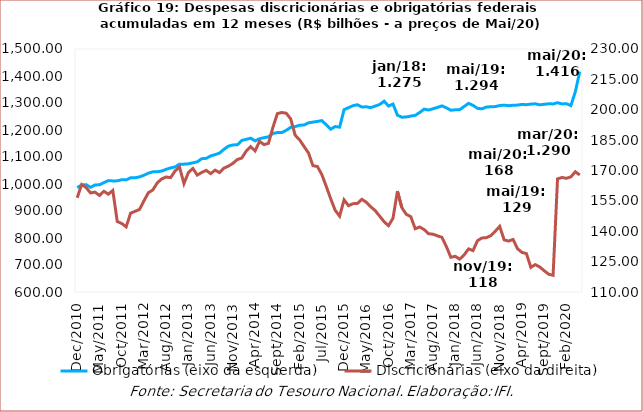
| Category | Obrigatórias (eixo da esquerda) |
|---|---|
| 2010-12-01 | 986781.688 |
| 2011-01-01 | 996172.239 |
| 2011-02-01 | 997634.296 |
| 2011-03-01 | 987635.4 |
| 2011-04-01 | 996568.562 |
| 2011-05-01 | 996931.85 |
| 2011-06-01 | 1005170.589 |
| 2011-07-01 | 1012610.651 |
| 2011-08-01 | 1011457.33 |
| 2011-09-01 | 1011617.294 |
| 2011-10-01 | 1015788.491 |
| 2011-11-01 | 1015213.034 |
| 2011-12-01 | 1022873.667 |
| 2012-01-01 | 1023050.58 |
| 2012-02-01 | 1026378.137 |
| 2012-03-01 | 1032361.754 |
| 2012-04-01 | 1040083.53 |
| 2012-05-01 | 1045125.838 |
| 2012-06-01 | 1045478.359 |
| 2012-07-01 | 1047982.888 |
| 2012-08-01 | 1054427.052 |
| 2012-09-01 | 1059589.508 |
| 2012-10-01 | 1063152.39 |
| 2012-11-01 | 1073480.276 |
| 2012-12-01 | 1073545.052 |
| 2013-01-01 | 1074732.401 |
| 2013-02-01 | 1078422.111 |
| 2013-03-01 | 1082140.912 |
| 2013-04-01 | 1093805.493 |
| 2013-05-01 | 1095042.509 |
| 2013-06-01 | 1103860.794 |
| 2013-07-01 | 1108798.082 |
| 2013-08-01 | 1114534.01 |
| 2013-09-01 | 1128632.661 |
| 2013-10-01 | 1140283.812 |
| 2013-11-01 | 1144778.255 |
| 2013-12-01 | 1145130.596 |
| 2014-01-01 | 1161509.66 |
| 2014-02-01 | 1165322.729 |
| 2014-03-01 | 1169665.693 |
| 2014-04-01 | 1159627.185 |
| 2014-05-01 | 1167835.252 |
| 2014-06-01 | 1171477.179 |
| 2014-07-01 | 1174949.064 |
| 2014-08-01 | 1187090.287 |
| 2014-09-01 | 1190534.637 |
| 2014-10-01 | 1190675.482 |
| 2014-11-01 | 1198810.042 |
| 2014-12-01 | 1209722.804 |
| 2015-01-01 | 1212375.298 |
| 2015-02-01 | 1217651.412 |
| 2015-03-01 | 1218550.551 |
| 2015-04-01 | 1226518.862 |
| 2015-05-01 | 1229236.627 |
| 2015-06-01 | 1231813.34 |
| 2015-07-01 | 1234759.415 |
| 2015-08-01 | 1219274.693 |
| 2015-09-01 | 1203113.686 |
| 2015-10-01 | 1212893.913 |
| 2015-11-01 | 1210441.611 |
| 2015-12-01 | 1275346.962 |
| 2016-01-01 | 1282567.768 |
| 2016-02-01 | 1289954.301 |
| 2016-03-01 | 1293650.762 |
| 2016-04-01 | 1285230.464 |
| 2016-05-01 | 1285892.405 |
| 2016-06-01 | 1282834.607 |
| 2016-07-01 | 1288608.07 |
| 2016-08-01 | 1294479.67 |
| 2016-09-01 | 1306795.655 |
| 2016-10-01 | 1288782.055 |
| 2016-11-01 | 1296230.695 |
| 2016-12-01 | 1255044.508 |
| 2017-01-01 | 1247283.172 |
| 2017-02-01 | 1248365.062 |
| 2017-03-01 | 1251552.136 |
| 2017-04-01 | 1254176.062 |
| 2017-05-01 | 1264827.487 |
| 2017-06-01 | 1277267.35 |
| 2017-07-01 | 1274094.591 |
| 2017-08-01 | 1278707.634 |
| 2017-09-01 | 1283723.094 |
| 2017-10-01 | 1289381.454 |
| 2017-11-01 | 1282219.192 |
| 2017-12-01 | 1273319.554 |
| 2018-01-01 | 1274683.6 |
| 2018-02-01 | 1275463.003 |
| 2018-03-01 | 1287042.78 |
| 2018-04-01 | 1298720.879 |
| 2018-05-01 | 1291193.048 |
| 2018-06-01 | 1280102.182 |
| 2018-07-01 | 1278557.513 |
| 2018-08-01 | 1284995.014 |
| 2018-09-01 | 1286142.209 |
| 2018-10-01 | 1286695.941 |
| 2018-11-01 | 1290559.003 |
| 2018-12-01 | 1292046.999 |
| 2019-01-01 | 1290027.296 |
| 2019-02-01 | 1291617.024 |
| 2019-03-01 | 1292276.34 |
| 2019-04-01 | 1294698.66 |
| 2019-05-01 | 1293684.854 |
| 2019-06-01 | 1295849.206 |
| 2019-07-01 | 1297062.057 |
| 2019-08-01 | 1293120.681 |
| 2019-09-01 | 1295308.63 |
| 2019-10-01 | 1297010.386 |
| 2019-11-01 | 1296596.814 |
| 2019-12-01 | 1301001.857 |
| 2020-01-01 | 1296599.591 |
| 2020-02-01 | 1297507.56 |
| 2020-03-01 | 1290404.412 |
| 2020-04-01 | 1341729.24 |
| 2020-05-01 | 1416495.665 |